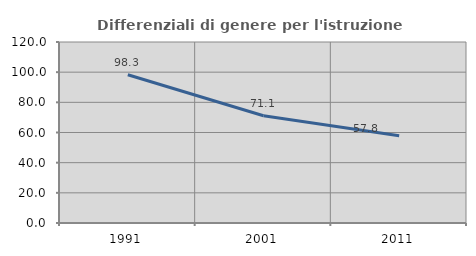
| Category | Differenziali di genere per l'istruzione superiore |
|---|---|
| 1991.0 | 98.262 |
| 2001.0 | 71.117 |
| 2011.0 | 57.782 |